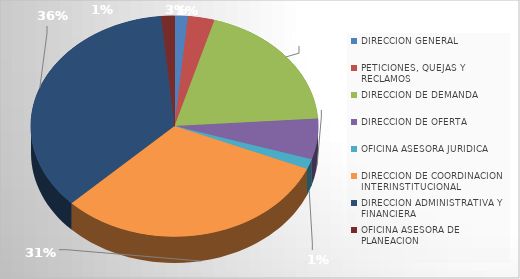
| Category | Series 0 |
|---|---|
| DIRECCION GENERAL | 1 |
| PETICIONES, QUEJAS Y RECLAMOS | 2 |
| DIRECCION DE DEMANDA | 13 |
| DIRECCION DE OFERTA | 4 |
| OFICINA ASESORA JURIDICA | 1 |
| DIRECCION DE COORDINACION INTERINSTITUCIONAL | 21 |
| DIRECCION ADMINISTRATIVA Y FINANCIERA | 24 |
| OFICINA ASESORA DE PLANEACION | 1 |